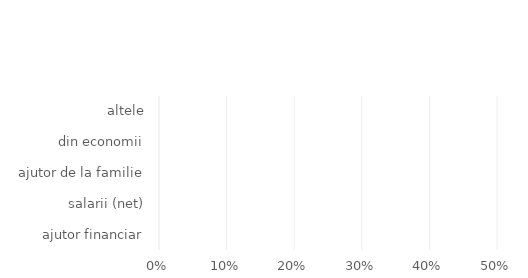
| Category | Series 0 |
|---|---|
| ajutor financiar | 0 |
| salarii (net) | 0 |
| ajutor de la familie | 0 |
| din economii | 0 |
| altele | 0 |